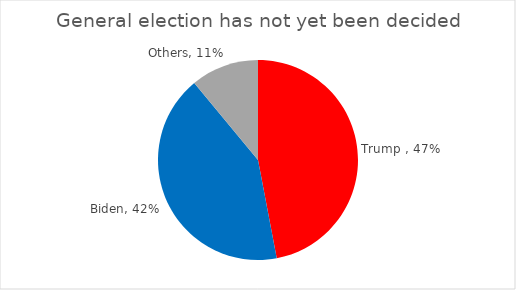
| Category | Series 0 |
|---|---|
| Trump  | 0.47 |
| Biden | 0.42 |
| Others | 0.11 |